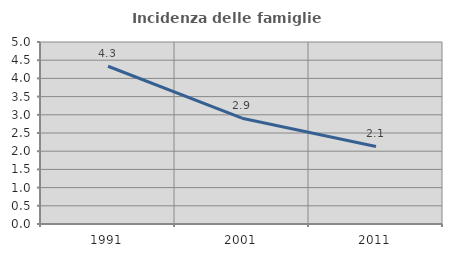
| Category | Incidenza delle famiglie numerose |
|---|---|
| 1991.0 | 4.334 |
| 2001.0 | 2.906 |
| 2011.0 | 2.13 |